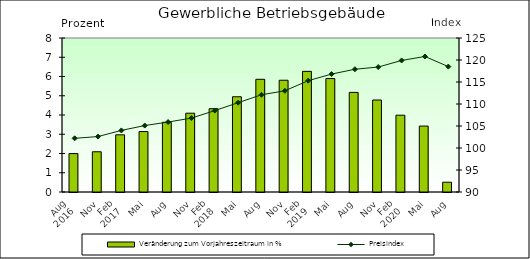
| Category | Veränderung zum Vorjahreszeitraum in % |
|---|---|
| 0 | 1.996 |
| 1 | 2.09 |
| 2 | 2.97 |
| 3 | 3.14 |
| 4 | 3.62 |
| 5 | 4.094 |
| 6 | 4.327 |
| 7 | 4.948 |
| 8 | 5.855 |
| 9 | 5.805 |
| 10 | 6.267 |
| 11 | 5.893 |
| 12 | 5.174 |
| 13 | 4.779 |
| 14 | 3.99 |
| 15 | 3.425 |
| 16 | 0.509 |